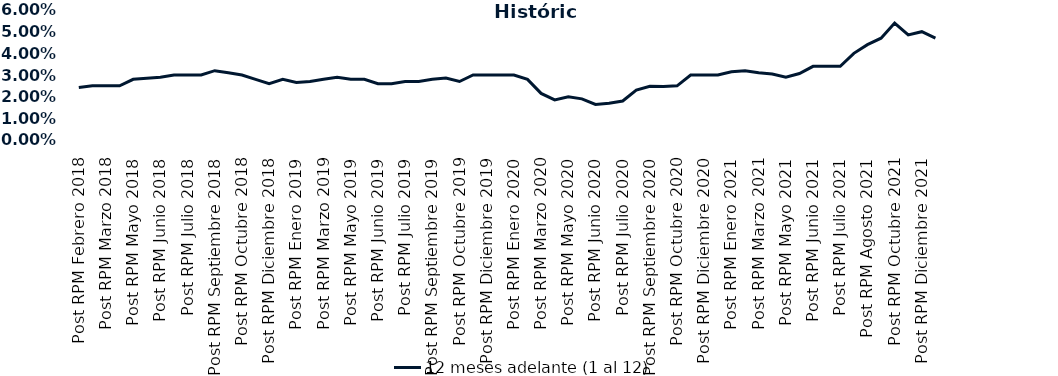
| Category | 12 meses adelante (1 al 12)  |
|---|---|
| Post RPM Febrero 2018 | 0.024 |
| Pre RPM Marzo 2018 | 0.025 |
| Post RPM Marzo 2018 | 0.025 |
| Pre RPM Mayo 2018 | 0.025 |
| Post RPM Mayo 2018 | 0.028 |
| Pre RPM Junio 2018 | 0.028 |
| Post RPM Junio 2018 | 0.029 |
| Pre RPM Julio 2018 | 0.03 |
| Post RPM Julio 2018 | 0.03 |
| Pre RPM Septiembre 2018 | 0.03 |
| Post RPM Septiembre 2018 | 0.032 |
| Pre RPM Octubre 2018 | 0.031 |
| Post RPM Octubre 2018 | 0.03 |
| Pre RPM Diciembre 2018 | 0.028 |
| Post RPM Diciembre 2018 | 0.026 |
| Pre RPM Enero 2019 | 0.028 |
| Post RPM Enero 2019 | 0.026 |
| Pre RPM Marzo 2019 | 0.027 |
| Post RPM Marzo 2019 | 0.028 |
| Pre RPM Mayo 2019 | 0.029 |
| Post RPM Mayo 2019 | 0.028 |
| Pre RPM Junio 2019 | 0.028 |
| Post RPM Junio 2019 | 0.026 |
| Pre RPM Julio 2019 | 0.026 |
| Post RPM Julio 2019 | 0.027 |
| Pre RPM Septiembre 2019 | 0.027 |
| Post RPM Septiembre 2019 | 0.028 |
| Pre RPM Octubre 2019 | 0.029 |
| Post RPM Octubre 2019 | 0.027 |
| Pre RPM Diciembre 2019 | 0.03 |
| Post RPM Diciembre 2019 | 0.03 |
| Pre RPM Enero 2020 | 0.03 |
| Post RPM Enero 2020 | 0.03 |
| Pre RPM Marzo 2020 | 0.028 |
| Post RPM Marzo 2020 | 0.022 |
| Pre RPM Mayo 2020 | 0.018 |
| Post RPM Mayo 2020 | 0.02 |
| Pre RPM Junio 2020 | 0.019 |
| Post RPM Junio 2020 | 0.016 |
| Pre RPM Julio 2020 | 0.017 |
| Post RPM Julio 2020 | 0.018 |
| Pre RPM Septiembre 2020 | 0.023 |
| Post RPM Septiembre 2020 | 0.025 |
| Pre RPM Octubre 2020 | 0.025 |
| Post RPM Octubre 2020 | 0.025 |
| Pre RPM Diciembre 2020 | 0.03 |
| Post RPM Diciembre 2020 | 0.03 |
| Pre RPM Enero 2021 | 0.03 |
| Post RPM Enero 2021 | 0.032 |
| Pre RPM Marzo 2021 | 0.032 |
| Post RPM Marzo 2021 | 0.031 |
| Pre RPM Mayo 2021 | 0.03 |
| Post RPM Mayo 2021 | 0.029 |
| Pre RPM Junio 2021 | 0.031 |
| Post RPM Junio 2021 | 0.034 |
| Pre RPM Julio 2021 | 0.034 |
| Post RPM Julio 2021 | 0.034 |
| Pre RPM Agosto 2021 | 0.04 |
| Post RPM Agosto 2021 | 0.044 |
| Pre RPM Octubre 2021 | 0.047 |
| Post RPM Octubre 2021 | 0.054 |
| Pre RPM Diciembre 2021 | 0.048 |
| Post RPM Diciembre 2021 | 0.05 |
| Pre RPM Enero 2022 | 0.047 |